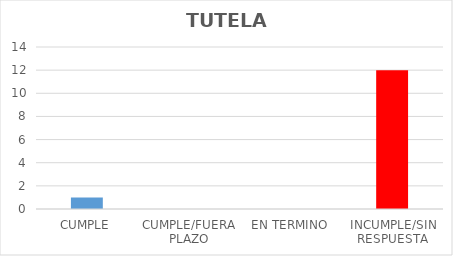
| Category | TOTAL |
|---|---|
| CUMPLE | 1 |
| CUMPLE/FUERA PLAZO | 0 |
| EN TERMINO | 0 |
| INCUMPLE/SIN RESPUESTA | 12 |